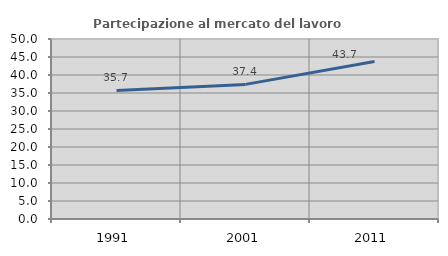
| Category | Partecipazione al mercato del lavoro  femminile |
|---|---|
| 1991.0 | 35.72 |
| 2001.0 | 37.394 |
| 2011.0 | 43.742 |